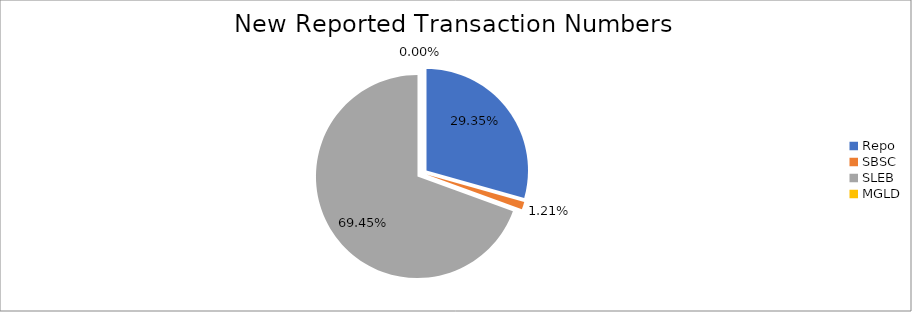
| Category | Series 0 |
|---|---|
| Repo | 294858 |
| SBSC | 12122 |
| SLEB | 697736 |
| MGLD | 15 |